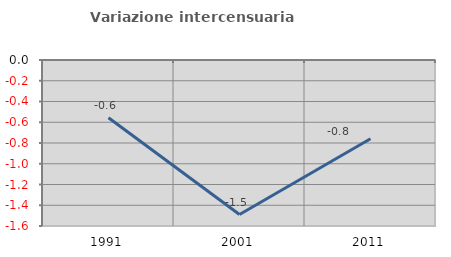
| Category | Variazione intercensuaria annua |
|---|---|
| 1991.0 | -0.556 |
| 2001.0 | -1.489 |
| 2011.0 | -0.759 |